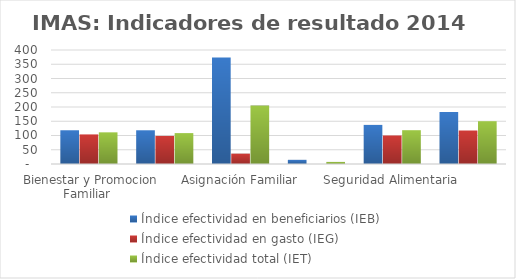
| Category | Índice efectividad en beneficiarios (IEB) | Índice efectividad en gasto (IEG)  | Índice efectividad total (IET) |
|---|---|---|---|
| Bienestar y Promocion Familiar | 118.398 | 103.808 | 111.103 |
| Avancemos | 118.336 | 98.483 | 108.409 |
| Asignación Familiar | 373.833 | 36.425 | 205.129 |
| Prestación Alimentaria | 14.625 | 0 | 7.312 |
| Seguridad Alimentaria | 137.185 | 100.088 | 118.636 |
| Resto de productos | 182.763 | 117.539 | 150.151 |